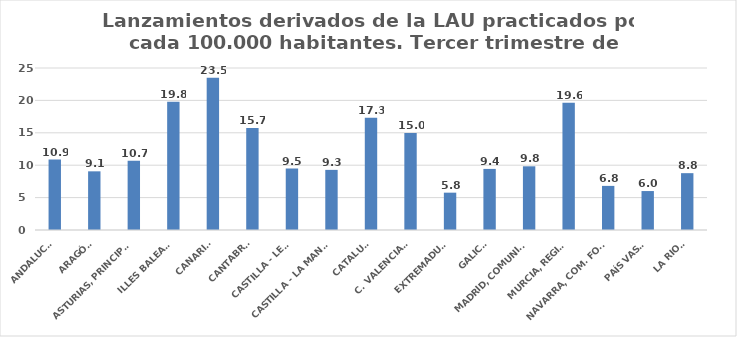
| Category | Series 0 |
|---|---|
| ANDALUCÍA | 10.874 |
| ARAGÓN | 9.054 |
| ASTURIAS, PRINCIPADO | 10.677 |
| ILLES BALEARS | 19.79 |
| CANARIAS | 23.488 |
| CANTABRIA | 15.745 |
| CASTILLA - LEÓN | 9.491 |
| CASTILLA - LA MANCHA | 9.278 |
| CATALUÑA | 17.326 |
| C. VALENCIANA | 14.972 |
| EXTREMADURA | 5.761 |
| GALICIA | 9.428 |
| MADRID, COMUNIDAD | 9.829 |
| MURCIA, REGIÓN | 19.632 |
| NAVARRA, COM. FORAL | 6.808 |
| PAÍS VASCO | 6.011 |
| LA RIOJA | 8.771 |